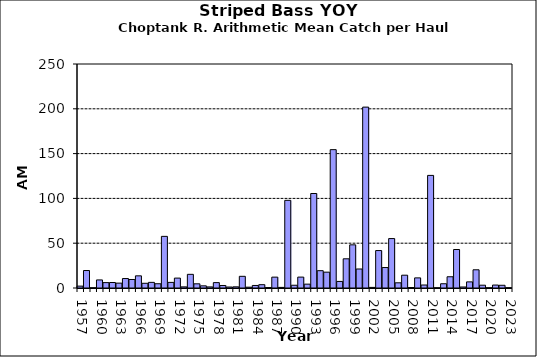
| Category | Series 0 |
|---|---|
| 1957.0 | 2.1 |
| 1958.0 | 19.5 |
| 1959.0 | 0.125 |
| 1960.0 | 9 |
| 1961.0 | 6 |
| 1962.0 | 6.125 |
| 1963.0 | 5.438 |
| 1964.0 | 10.562 |
| 1965.0 | 9.5 |
| 1966.0 | 13.583 |
| 1967.0 | 5.25 |
| 1968.0 | 6.292 |
| 1969.0 | 4.75 |
| 1970.0 | 57.625 |
| 1971.0 | 6.25 |
| 1972.0 | 11.042 |
| 1973.0 | 1.25 |
| 1974.0 | 15.25 |
| 1975.0 | 4.667 |
| 1976.0 | 2.417 |
| 1977.0 | 1.208 |
| 1978.0 | 6 |
| 1979.0 | 2.792 |
| 1980.0 | 1.083 |
| 1981.0 | 1.292 |
| 1982.0 | 13.042 |
| 1983.0 | 0.917 |
| 1984.0 | 2.833 |
| 1985.0 | 3.708 |
| 1986.0 | 0.5 |
| 1987.0 | 12.125 |
| 1988.0 | 0.667 |
| 1989.0 | 97.833 |
| 1990.0 | 3.083 |
| 1991.0 | 12.167 |
| 1992.0 | 4.292 |
| 1993.0 | 105.458 |
| 1994.0 | 19.333 |
| 1995.0 | 17.667 |
| 1996.0 | 154.417 |
| 1997.0 | 7.333 |
| 1998.0 | 32.583 |
| 1999.0 | 48.167 |
| 2000.0 | 21.208 |
| 2001.0 | 201.875 |
| 2002.0 | 0.667 |
| 2003.0 | 41.792 |
| 2004.0 | 22.83 |
| 2005.0 | 55.17 |
| 2006.0 | 5.792 |
| 2007.0 | 14.292 |
| 2008.0 | 0.542 |
| 2009.0 | 11.292 |
| 2010.0 | 3.333 |
| 2011.0 | 125.667 |
| 2012.0 | 0.125 |
| 2013.0 | 4.75 |
| 2014.0 | 12.542 |
| 2015.0 | 42.958 |
| 2016.0 | 1.125 |
| 2017.0 | 6.833 |
| 2018.0 | 20.333 |
| 2019.0 | 3.125 |
| 2020.0 | 0.17 |
| 2021.0 | 3.292 |
| 2022.0 | 3.042 |
| 2023.0 | 0.292 |